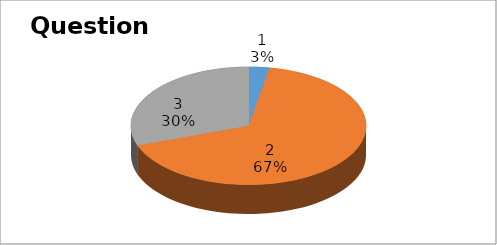
| Category | Series 0 |
|---|---|
| 0 | 6 |
| 1 | 140 |
| 2 | 64 |